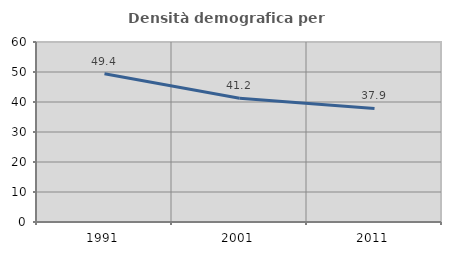
| Category | Densità demografica |
|---|---|
| 1991.0 | 49.434 |
| 2001.0 | 41.221 |
| 2011.0 | 37.868 |